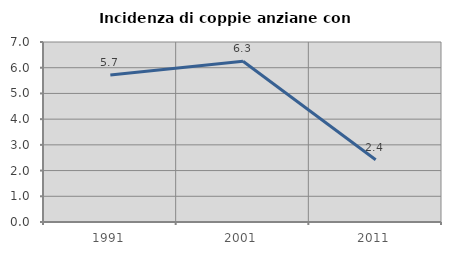
| Category | Incidenza di coppie anziane con figli |
|---|---|
| 1991.0 | 5.714 |
| 2001.0 | 6.25 |
| 2011.0 | 2.419 |